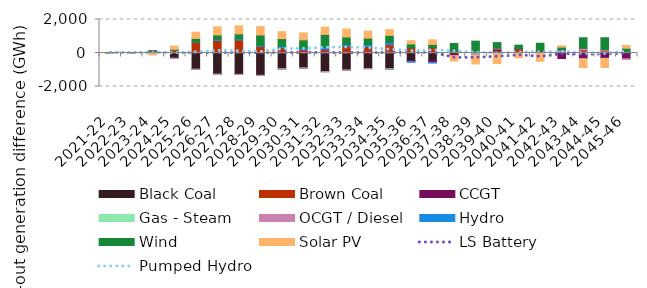
| Category | Black Coal | Brown Coal | CCGT | Gas - Steam | OCGT / Diesel | Hydro | Wind | Solar PV |
|---|---|---|---|---|---|---|---|---|
| 2021-22 | -0.018 | -0.006 | -0.001 | 0 | -0.001 | 0 | -0.001 | -2.195 |
| 2022-23 | -0.011 | -0.02 | 0 | 0 | -0.001 | 0.001 | -0.034 | -1.678 |
| 2023-24 | 120.245 | 1.266 | 0.004 | 0 | 0.137 | -1.093 | 0.045 | -118.074 |
| 2024-25 | -316.554 | 177.197 | -0.001 | -0.117 | -3.978 | 4.95 | 41.388 | 183.597 |
| 2025-26 | -973.189 | 629.065 | -0.001 | 0 | -0.001 | 22.431 | 220.678 | 365.636 |
| 2026-27 | -1267.353 | 746.07 | -0.001 | -0.125 | -0.335 | 68.423 | 265.337 | 484.375 |
| 2027-28 | -1278.429 | 775.844 | -0.001 | -0.108 | -0.266 | 69.325 | 298.41 | 476.686 |
| 2028-29 | -1337.049 | 392.186 | -0.001 | 0 | -0.001 | 62.544 | 623.077 | 496.189 |
| 2029-30 | -942.31 | 319.631 | -0.001 | 0 | -0.153 | 84.713 | 456.368 | 413.926 |
| 2030-31 | -900.092 | 205.546 | -0.001 | 0 | -0.033 | 87.316 | 496.242 | 410.976 |
| 2031-32 | -1112.049 | 221.915 | -0.001 | -0.333 | -0.798 | 110.12 | 776.061 | 432.253 |
| 2032-33 | -1022.289 | 419.128 | -0.001 | -0.177 | -0.14 | 88.486 | 449.948 | 470.162 |
| 2033-34 | -932.124 | 388.106 | -0.001 | -0.41 | -0.001 | 116.036 | 386.185 | 419.66 |
| 2034-35 | -944.637 | 498.612 | -0.001 | -0.007 | 0.017 | 134.17 | 419.175 | 339.045 |
| 2035-36 | -448.045 | 310.928 | -64.575 | -0.16 | -11.619 | -29.928 | 231.695 | 190.593 |
| 2036-37 | -444.629 | 325.276 | -128.363 | -0.585 | -3.304 | -17.016 | 187.048 | 276.256 |
| 2037-38 | -90.927 | 122.885 | -55.837 | -2.642 | -35.196 | 13.798 | 431.063 | -293.523 |
| 2038-39 | -12.064 | 89.034 | -34.464 | -14.075 | -52.953 | -8.752 | 619.34 | -529.973 |
| 2039-40 | -24.727 | 153.207 | 83.718 | 0 | 47.424 | -14.613 | 335.838 | -591.884 |
| 2040-41 | -11.315 | 229.656 | 23.747 | 0 | 3.512 | -4.926 | 211.747 | -265.114 |
| 2041-42 | -18.294 | 122.908 | 11.095 | 0 | 1.671 | -4.247 | 446.163 | -468.761 |
| 2042-43 | -35.967 | 89.631 | -293.688 | 0 | 89.774 | 3.003 | 166.225 | 83.678 |
| 2043-44 | -27.228 | 183.756 | -302.287 | 0 | 94.908 | -17.439 | 630.177 | -524.947 |
| 2044-45 | -15.7 | 119.492 | -299.948 | 0 | 79.349 | -11.77 | 712.597 | -539.513 |
| 2045-46 | -31.853 | 15.551 | -309.161 | 0 | -33.384 | 13.807 | 256.308 | 165.756 |